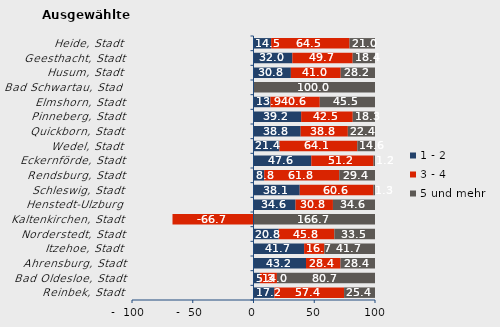
| Category | 1 - 2 | 3 - 4 | 5 und mehr |
|---|---|---|---|
| Reinbek, Stadt | 17.16 | 57.396 | 25.444 |
| Bad Oldesloe, Stadt | 5.263 | 14.035 | 80.702 |
| Ahrensburg, Stadt | 43.226 | 28.387 | 28.387 |
| Itzehoe, Stadt | 41.667 | 16.667 | 41.667 |
| Norderstedt, Stadt | 20.763 | 45.763 | 33.475 |
| Kaltenkirchen, Stadt | 0 | -66.667 | 166.667 |
| Henstedt-Ulzburg | 34.615 | 30.769 | 34.615 |
| Schleswig, Stadt | 38.065 | 60.645 | 1.29 |
| Rendsburg, Stadt | 8.824 | 61.765 | 29.412 |
| Eckernförde, Stadt | 47.561 | 51.22 | 1.22 |
| Wedel, Stadt | 21.359 | 64.078 | 14.563 |
| Quickborn, Stadt | 38.824 | 38.824 | 22.353 |
| Pinneberg, Stadt | 39.216 | 42.484 | 18.301 |
| Elmshorn, Stadt | 13.939 | 40.606 | 45.455 |
| Bad Schwartau, Stadt | 0 | 0 | 100 |
| Husum, Stadt | 30.769 | 41.026 | 28.205 |
| Geesthacht, Stadt | 31.973 | 49.66 | 18.367 |
| Heide, Stadt | 14.516 | 64.516 | 20.968 |